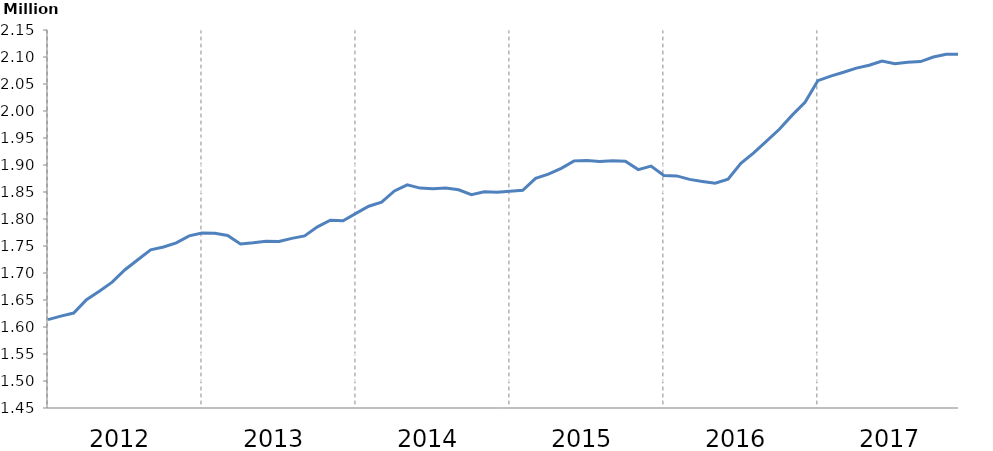
| Category | Series 0 |
|---|---|
|  | 1.614 |
|  | 1.62 |
|  | 1.626 |
|  | 1.65 |
|  | 1.666 |
|  | 1.683 |
| 2012 | 1.706 |
|  | 1.725 |
|  | 1.743 |
|  | 1.748 |
|  | 1.756 |
|  | 1.769 |
|  | 1.774 |
|  | 1.774 |
|  | 1.77 |
|  | 1.754 |
|  | 1.756 |
|  | 1.759 |
| 2013 | 1.758 |
|  | 1.764 |
|  | 1.769 |
|  | 1.785 |
|  | 1.798 |
|  | 1.797 |
|  | 1.81 |
|  | 1.824 |
|  | 1.831 |
|  | 1.852 |
|  | 1.863 |
|  | 1.857 |
| 2014 | 1.856 |
|  | 1.857 |
|  | 1.854 |
|  | 1.845 |
|  | 1.851 |
|  | 1.85 |
|  | 1.851 |
|  | 1.853 |
|  | 1.875 |
|  | 1.883 |
|  | 1.894 |
|  | 1.908 |
| 2015 | 1.908 |
|  | 1.906 |
|  | 1.908 |
|  | 1.907 |
|  | 1.891 |
|  | 1.898 |
|  | 1.88 |
|  | 1.88 |
|  | 1.873 |
|  | 1.87 |
|  | 1.866 |
|  | 1.874 |
| 2016 | 1.903 |
|  | 1.922 |
|  | 1.944 |
|  | 1.966 |
|  | 1.992 |
|  | 2.016 |
|  | 2.056 |
|  | 2.065 |
|  | 2.072 |
|  | 2.079 |
|  | 2.085 |
|  | 2.093 |
| 2017 | 2.088 |